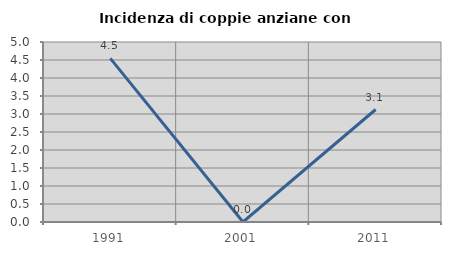
| Category | Incidenza di coppie anziane con figli |
|---|---|
| 1991.0 | 4.545 |
| 2001.0 | 0 |
| 2011.0 | 3.125 |